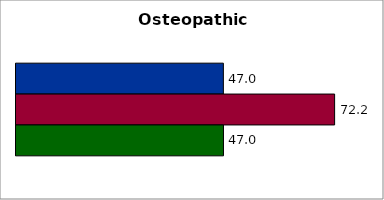
| Category | 50 states and D.C. | SREB states | State |
|---|---|---|---|
| 0 | 46.994 | 72.208 | 47.02 |